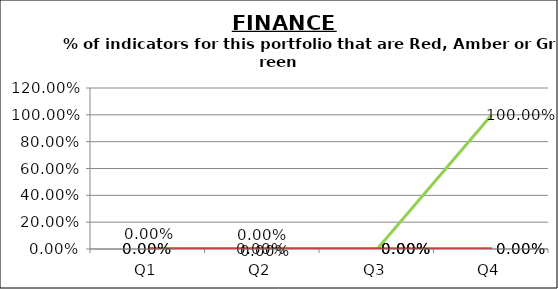
| Category | Green | Amber | Red |
|---|---|---|---|
| Q1 | 0 | 0 | 0 |
| Q2 | 0 | 0 | 0 |
| Q3 | 0 | 0 | 0 |
| Q4 | 1 | 0 | 0 |